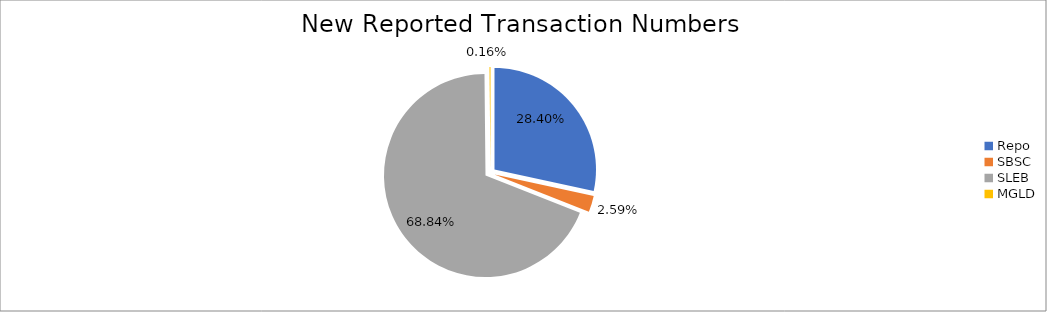
| Category | Series 0 |
|---|---|
| Repo | 362967 |
| SBSC | 33163 |
| SLEB | 879853 |
| MGLD | 2058 |